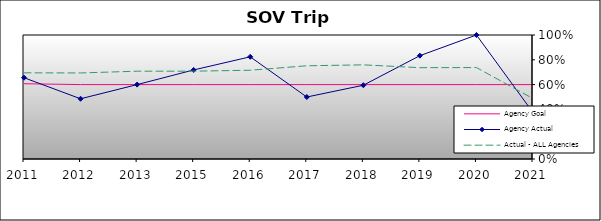
| Category | Agency Goal | Agency Actual | Actual - ALL Agencies |
|---|---|---|---|
| 2011.0 | 0.607 | 0.656 | 0.695 |
| 2012.0 | 0.6 | 0.486 | 0.694 |
| 2013.0 | 0.6 | 0.6 | 0.708 |
| 2015.0 | 0.6 | 0.718 | 0.708 |
| 2016.0 | 0.6 | 0.824 | 0.716 |
| 2017.0 | 0.6 | 0.5 | 0.752 |
| 2018.0 | 0.6 | 0.595 | 0.759 |
| 2019.0 | 0.6 | 0.833 | 0.736 |
| 2020.0 | 0.6 | 1 | 0.737 |
| 2021.0 | 0.6 | 0.375 | 0.487 |